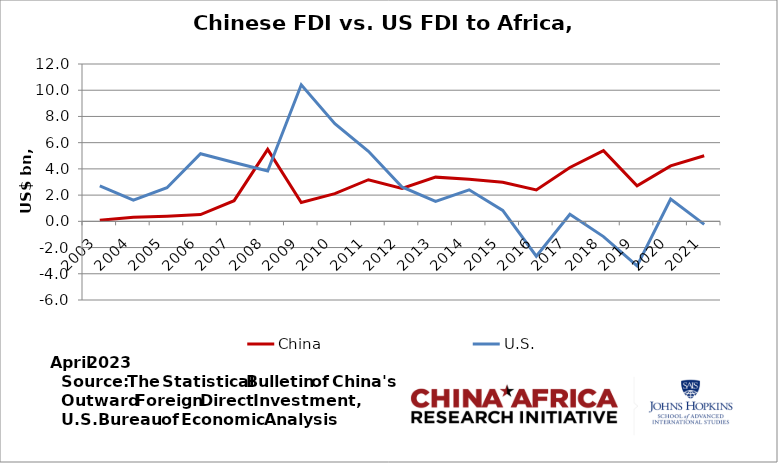
| Category | China | U.S. |
|---|---|---|
| 2003.0 | 0.075 | 2.697 |
| 2004.0 | 0.317 | 1.611 |
| 2005.0 | 0.392 | 2.564 |
| 2006.0 | 0.52 | 5.157 |
| 2007.0 | 1.574 | 4.49 |
| 2008.0 | 5.491 | 3.837 |
| 2009.0 | 1.439 | 10.417 |
| 2010.0 | 2.112 | 7.442 |
| 2011.0 | 3.173 | 5.34 |
| 2012.0 | 2.517 | 2.624 |
| 2013.0 | 3.371 | 1.516 |
| 2014.0 | 3.202 | 2.405 |
| 2015.0 | 2.978 | 0.829 |
| 2016.0 | 2.399 | -2.66 |
| 2017.0 | 4.105 | 0.534 |
| 2018.0 | 5.389 | -1.164 |
| 2019.0 | 2.704 | -3.393 |
| 2020.0 | 4.226 | 1.7 |
| 2021.0 | 5 | -0.23 |